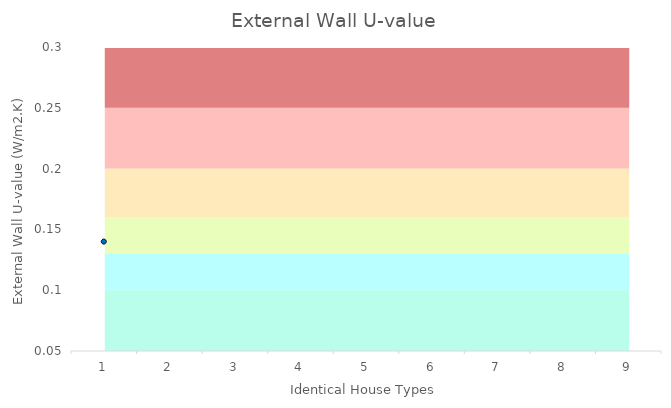
| Category | Series 0 | Series 1 | Series 2 | Series 3 | Series 4 | Series 5 |
|---|---|---|---|---|---|---|
| 0 | 0.1 | 0.03 | 0.03 | 0.04 | 0.05 | 0.05 |
| 1 | 0.1 | 0.03 | 0.03 | 0.04 | 0.05 | 0.05 |
| 2 | 0.1 | 0.03 | 0.03 | 0.04 | 0.05 | 0.05 |
| 3 | 0.1 | 0.03 | 0.03 | 0.04 | 0.05 | 0.05 |
| 4 | 0.1 | 0.03 | 0.03 | 0.04 | 0.05 | 0.05 |
| 5 | 0.1 | 0.03 | 0.03 | 0.04 | 0.05 | 0.05 |
| 6 | 0.1 | 0.03 | 0.03 | 0.04 | 0.05 | 0.05 |
| 7 | 0.1 | 0.03 | 0.03 | 0.04 | 0.05 | 0.05 |
| 8 | 0.1 | 0.03 | 0.03 | 0.04 | 0.05 | 0.05 |